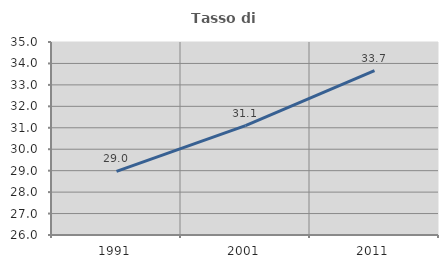
| Category | Tasso di occupazione   |
|---|---|
| 1991.0 | 28.968 |
| 2001.0 | 31.103 |
| 2011.0 | 33.663 |